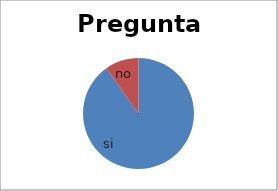
| Category | Series 0 |
|---|---|
| si | 331 |
| no | 36 |